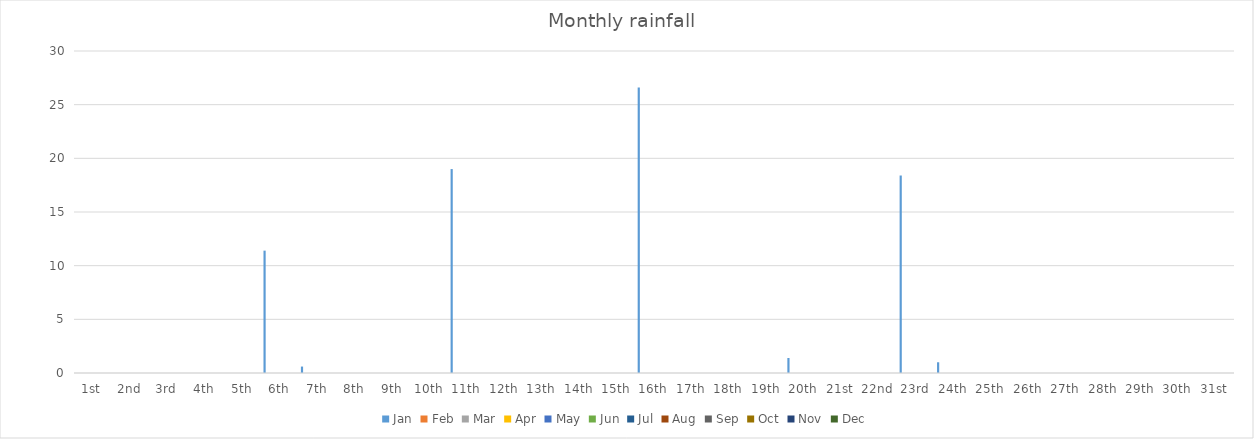
| Category | Jan | Feb | Mar | Apr | May | Jun | Jul | Aug | Sep | Oct | Nov | Dec |
|---|---|---|---|---|---|---|---|---|---|---|---|---|
| 1st | 0 |  |  |  |  |  |  |  |  |  |  |  |
| 2nd | 0 |  |  |  |  |  |  |  |  |  |  |  |
| 3rd | 0 |  |  |  |  |  |  |  |  |  |  |  |
| 4th | 0 |  |  |  |  |  |  |  |  |  |  |  |
| 5th | 0 |  |  |  |  |  |  |  |  |  |  |  |
| 6th | 11.4 |  |  |  |  |  |  |  |  |  |  |  |
| 7th | 0.6 |  |  |  |  |  |  |  |  |  |  |  |
| 8th | 0 |  |  |  |  |  |  |  |  |  |  |  |
| 9th | 0 |  |  |  |  |  |  |  |  |  |  |  |
| 10th | 0 |  |  |  |  |  |  |  |  |  |  |  |
| 11th | 19 |  |  |  |  |  |  |  |  |  |  |  |
| 12th | 0 |  |  |  |  |  |  |  |  |  |  |  |
| 13th | 0 |  |  |  |  |  |  |  |  |  |  |  |
| 14th | 0 |  |  |  |  |  |  |  |  |  |  |  |
| 15th | 0 |  |  |  |  |  |  |  |  |  |  |  |
| 16th | 26.6 |  |  |  |  |  |  |  |  |  |  |  |
| 17th | 0 |  |  |  |  |  |  |  |  |  |  |  |
| 18th | 0 |  |  |  |  |  |  |  |  |  |  |  |
| 19th | 0 |  |  |  |  |  |  |  |  |  |  |  |
| 20th | 1.4 |  |  |  |  |  |  |  |  |  |  |  |
| 21st | 0 |  |  |  |  |  |  |  |  |  |  |  |
| 22nd | 0 |  |  |  |  |  |  |  |  |  |  |  |
| 23rd | 18.4 |  |  |  |  |  |  |  |  |  |  |  |
| 24th | 1 |  |  |  |  |  |  |  |  |  |  |  |
| 25th | 0 |  |  |  |  |  |  |  |  |  |  |  |
| 26th | 0 |  |  |  |  |  |  |  |  |  |  |  |
| 27th | 0 |  |  |  |  |  |  |  |  |  |  |  |
| 28th | 0 |  |  |  |  |  |  |  |  |  |  |  |
| 29th | 0 |  |  |  |  |  |  |  |  |  |  |  |
| 30th | 0 |  |  |  |  |  |  |  |  |  |  |  |
| 31st | 0 |  |  |  |  |  |  |  |  |  |  |  |